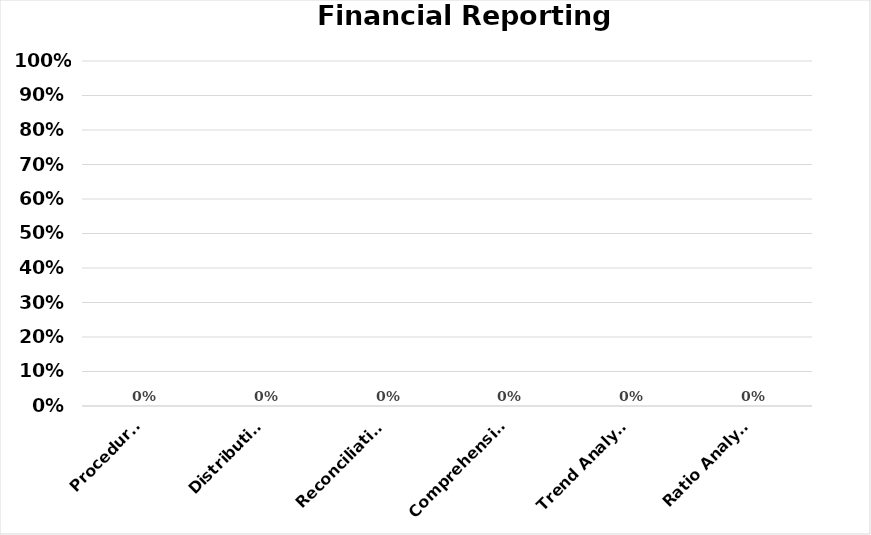
| Category | Series 0 |
|---|---|
| Procedures | 0 |
| Distribution | 0 |
| Reconciliations | 0 |
| Comprehensive | 0 |
| Trend Analysis  | 0 |
| Ratio Analysis | 0 |